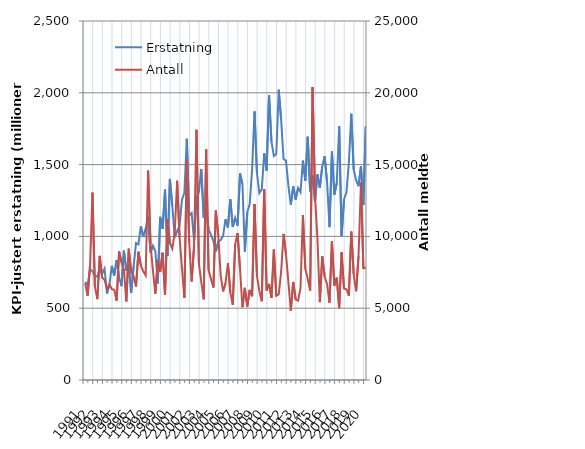
| Category | Erstatning |
|---|---|
| 1991.0 | 682.861 |
| nan | 660.593 |
| nan | 770.781 |
| nan | 757.68 |
| 1992.0 | 724.967 |
| nan | 720.337 |
| nan | 769.124 |
| nan | 738.283 |
| 1993.0 | 775.228 |
| nan | 602.058 |
| nan | 664.256 |
| nan | 794.965 |
| 1994.0 | 727.895 |
| nan | 835.014 |
| nan | 715.669 |
| nan | 653.422 |
| 1995.0 | 900.586 |
| nan | 761.203 |
| nan | 803.181 |
| nan | 605.711 |
| 1996.0 | 789.173 |
| nan | 953.39 |
| nan | 943.881 |
| nan | 1071.001 |
| 1997.0 | 996.152 |
| nan | 1053.434 |
| nan | 1142.066 |
| nan | 887.884 |
| 1998.0 | 935.373 |
| nan | 896.35 |
| nan | 671.783 |
| nan | 1136.193 |
| 1999.0 | 1052.729 |
| nan | 1325.657 |
| nan | 863.644 |
| nan | 1400.154 |
| 2000.0 | 1214.232 |
| nan | 993.707 |
| nan | 1038.895 |
| nan | 1072.169 |
| 2001.0 | 1253.265 |
| nan | 1304.559 |
| nan | 1679.765 |
| nan | 1144.776 |
| 2002.0 | 1162.727 |
| nan | 970.425 |
| nan | 1266.256 |
| nan | 1309.736 |
| 2003.0 | 1469.594 |
| nan | 1128.08 |
| nan | 1190.808 |
| nan | 1048.721 |
| 2004.0 | 1011.439 |
| nan | 967.557 |
| nan | 894.762 |
| nan | 963.959 |
| 2005.0 | 974.405 |
| nan | 1002.461 |
| nan | 1119.883 |
| nan | 1062.719 |
| 2006.0 | 1258.391 |
| nan | 1065.827 |
| nan | 1130.31 |
| nan | 1075.24 |
| 2007.0 | 1439.915 |
| nan | 1364.05 |
| nan | 893.677 |
| nan | 1169.116 |
| 2008.0 | 1224.519 |
| nan | 1465.019 |
| nan | 1870.593 |
| nan | 1441 |
| 2009.0 | 1301.099 |
| nan | 1328.36 |
| nan | 1578.846 |
| nan | 1458.773 |
| 2010.0 | 1984.188 |
| nan | 1660.479 |
| nan | 1559.014 |
| nan | 1574.052 |
| 2011.0 | 2021.055 |
| nan | 1813.246 |
| nan | 1538.78 |
| nan | 1527.545 |
| 2012.0 | 1353.017 |
| nan | 1220.672 |
| nan | 1348.959 |
| nan | 1256.877 |
| 2013.0 | 1337.311 |
| nan | 1307.667 |
| nan | 1527.592 |
| nan | 1388.401 |
| 2014.0 | 1693.847 |
| nan | 1313.108 |
| nan | 1424.554 |
| nan | 1243.361 |
| 2015.0 | 1432.487 |
| nan | 1339.063 |
| nan | 1487.095 |
| nan | 1558.19 |
| 2016.0 | 1375.58 |
| nan | 1064.405 |
| nan | 1591.137 |
| nan | 1290.489 |
| 2017.0 | 1371.785 |
| nan | 1767.479 |
| nan | 1003.271 |
| nan | 1257.841 |
| 2018.0 | 1305.9 |
| nan | 1512.06 |
| nan | 1853.654 |
| nan | 1464.441 |
| 2019.0 | 1391.758 |
| nan | 1349.421 |
| nan | 1486.971 |
| nan | 1218.36 |
| 2020.0 | 1766.411 |